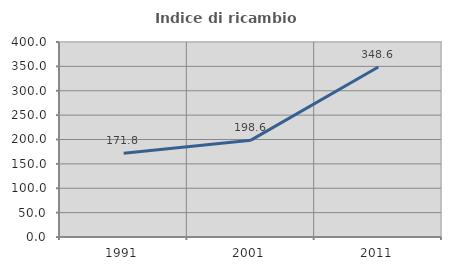
| Category | Indice di ricambio occupazionale  |
|---|---|
| 1991.0 | 171.756 |
| 2001.0 | 198.621 |
| 2011.0 | 348.571 |